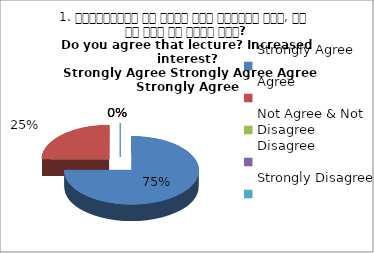
| Category | 1. व्याख्यान से रूचि में वृद्धि हुई, आप इस बात से सहमत हैं?
Do you agree that lecture? Increased interest?
 Strongly Agree Strongly Agree Agree Strongly Agree |
|---|---|
| Strongly Agree | 3 |
| Agree | 1 |
| Not Agree & Not Disagree | 0 |
| Disagree | 0 |
| Strongly Disagree | 0 |